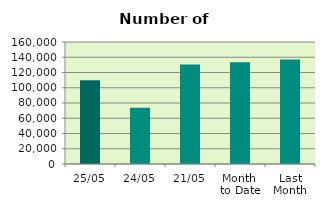
| Category | Series 0 |
|---|---|
| 25/05 | 109850 |
| 24/05 | 73750 |
| 21/05 | 130350 |
| Month 
to Date | 133525.294 |
| Last
Month | 137031.8 |